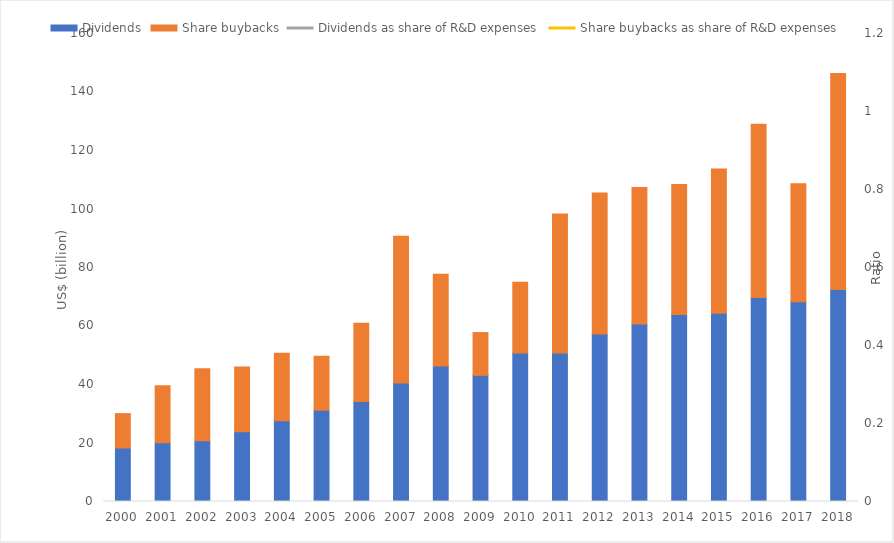
| Category | Dividends | Share buybacks |
|---|---|---|
| 2000.0 | 18.294 | 11.745 |
| 2001.0 | 20.061 | 19.492 |
| 2002.0 | 20.809 | 24.549 |
| 2003.0 | 23.888 | 22.116 |
| 2004.0 | 27.63 | 23.054 |
| 2005.0 | 31.158 | 18.491 |
| 2006.0 | 34.216 | 26.759 |
| 2007.0 | 40.471 | 50.213 |
| 2008.0 | 46.308 | 31.354 |
| 2009.0 | 43.125 | 14.628 |
| 2010.0 | 50.745 | 24.179 |
| 2011.0 | 50.739 | 47.578 |
| 2012.0 | 57.276 | 48.215 |
| 2013.0 | 60.673 | 46.65 |
| 2014.0 | 63.927 | 44.457 |
| 2015.0 | 64.325 | 49.372 |
| 2016.0 | 69.739 | 59.237 |
| 2017.0 | 68.316 | 40.311 |
| 2018.0 | 72.507 | 73.839 |